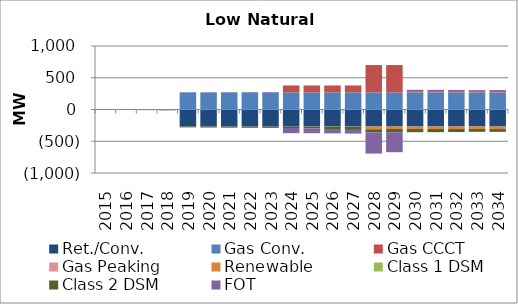
| Category | Ret./Conv. | Gas Conv. | Gas CCCT | Gas Peaking | Renewable | Class 1 DSM | Class 2 DSM | FOT |
|---|---|---|---|---|---|---|---|---|
| 2015.0 | 0 | 0 | 0 | 0 | 0 | 0 | -0.59 | 0.431 |
| 2016.0 | 0 | 0 | 0 | 0 | 0 | 0 | -5.22 | 3.006 |
| 2017.0 | 0 | 0 | 0 | 0 | 0 | 0 | -9.69 | 5.252 |
| 2018.0 | 0 | 0 | 0 | 0 | 0 | 0 | -13.3 | 7.16 |
| 2019.0 | -268 | 269 | 0 | 0 | 0 | 0 | -13.59 | 4.031 |
| 2020.0 | -268 | 269 | 0 | 0 | 0 | 0 | -16 | 4.375 |
| 2021.0 | -268 | 269 | 0 | 0 | 0 | 0 | -17.79 | 5.068 |
| 2022.0 | -268 | 269 | 0 | 0 | 0 | 0 | -20.08 | 6.009 |
| 2023.0 | -268 | 269 | 0 | 0 | 0 | 0 | -21.08 | 6.62 |
| 2024.0 | -268 | 269 | 109.6 | 0 | 0 | 0 | -23.47 | -81.359 |
| 2025.0 | -268 | 269 | 109.6 | 0 | 0 | -3.4 | -28.14 | -74.331 |
| 2026.0 | -268 | 269 | 109.6 | 0 | 0 | -3.4 | -35.34 | -68.971 |
| 2027.0 | -268 | 269 | 109.6 | 0 | 0 | -3.4 | -49.8 | -57.847 |
| 2028.0 | -268 | 269 | 431.2 | 0 | -40 | -3.4 | -49.9 | -332.885 |
| 2029.0 | -268 | 269 | 431.2 | 0 | -40 | 0.33 | -49.66 | -314.61 |
| 2030.0 | -268 | 269 | 8.2 | 0 | -40 | 0.33 | -49.12 | 32.244 |
| 2031.0 | -268 | 269 | 8.2 | 0 | -40 | 0.33 | -48.7 | 32.042 |
| 2032.0 | -268 | 269 | 8.2 | 0 | -40 | 0.33 | -47 | 30.785 |
| 2033.0 | -268 | 269 | 8.2 | 0 | -40 | 0.33 | -43.16 | 27.795 |
| 2034.0 | -268 | 269 | 8.2 | 0 | -40 | -1.02 | -42.47 | 29.003 |